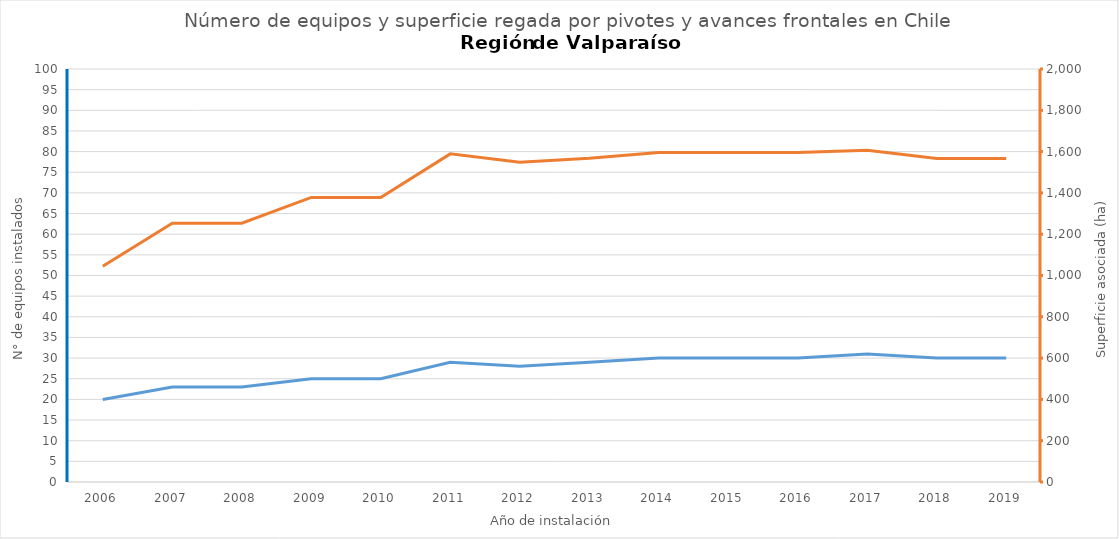
| Category | N° |
|---|---|
| 2006.0 | 20 |
| 2007.0 | 23 |
| 2008.0 | 23 |
| 2009.0 | 25 |
| 2010.0 | 25 |
| 2011.0 | 29 |
| 2012.0 | 28 |
| 2013.0 | 29 |
| 2014.0 | 30 |
| 2015.0 | 30 |
| 2016.0 | 30 |
| 2017.0 | 31 |
| 2018.0 | 30 |
| 2019.0 | 30 |